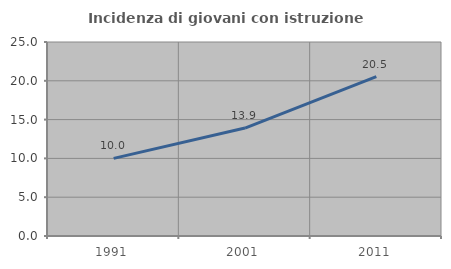
| Category | Incidenza di giovani con istruzione universitaria |
|---|---|
| 1991.0 | 10 |
| 2001.0 | 13.907 |
| 2011.0 | 20.536 |